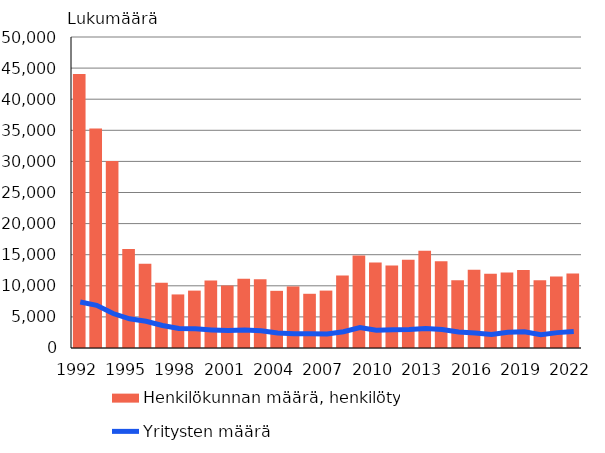
| Category | Henkilökunnan määrä, henkilötyövuotta |
|---|---|
| 1992.0 | 44050 |
| 1993.0 | 35282 |
| 1994.0 | 30052 |
| 1995.0 | 15922 |
| 1996.0 | 13551 |
| 1997.0 | 10473 |
| 1998.0 | 8612 |
| 1999.0 | 9226 |
| 2000.0 | 10849 |
| 2001.0 | 10047 |
| 2002.0 | 11126 |
| 2003.0 | 11061 |
| 2004.0 | 9191 |
| 2005.0 | 9898 |
| 2006.0 | 8717 |
| 2007.0 | 9230 |
| 2008.0 | 11660 |
| 2009.0 | 14860 |
| 2010.0 | 13759 |
| 2011.0 | 13270 |
| 2012.0 | 14206 |
| 2013.0 | 15637 |
| 2014.0 | 13951 |
| 2015.0 | 10902 |
| 2016.0 | 12580 |
| 2017.0 | 11943 |
| 2018.0 | 12127 |
| 2019.0 | 12548 |
| 2020.0 | 10876 |
| 2021.0 | 11490 |
| 2022.0 | 11975 |